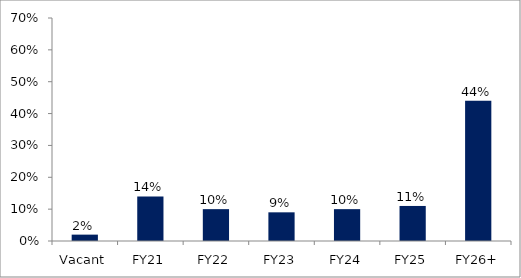
| Category | Series 0 |
|---|---|
| Vacant | 0.02 |
| FY21 | 0.14 |
| FY22 | 0.1 |
| FY23 | 0.09 |
| FY24 | 0.1 |
| FY25 | 0.11 |
| FY26+ | 0.44 |